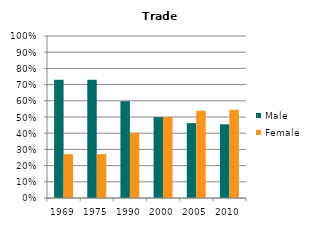
| Category | Male | Female |
|---|---|---|
| 1969.0 | 0.729 | 0.271 |
| 1975.0 | 0.729 | 0.271 |
| 1990.0 | 0.597 | 0.403 |
| 2000.0 | 0.499 | 0.501 |
| 2005.0 | 0.462 | 0.538 |
| 2010.0 | 0.455 | 0.545 |